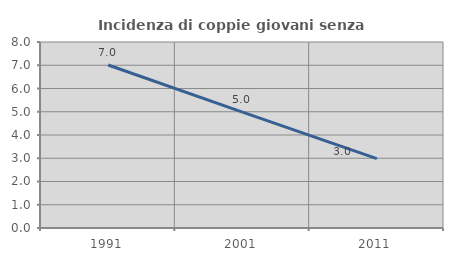
| Category | Incidenza di coppie giovani senza figli |
|---|---|
| 1991.0 | 7.011 |
| 2001.0 | 4.986 |
| 2011.0 | 2.982 |